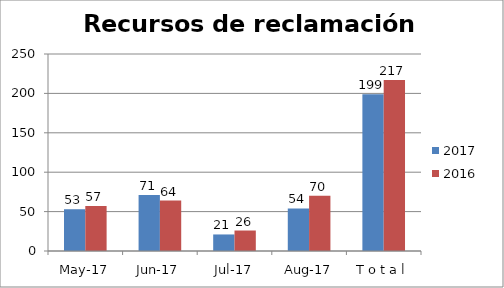
| Category | 2017 | 2016 |
|---|---|---|
| may-17 | 53 | 57 |
| jun-17 | 71 | 64 |
| jul-17 | 21 | 26 |
| ago-17 | 54 | 70 |
| T o t a l | 199 | 217 |